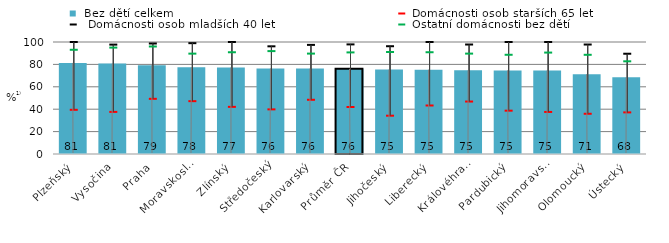
| Category |  Bez dětí celkem |
|---|---|
|   Plzeňský | 81.337 |
|   Vysočina | 80.741 |
|   Praha | 79.226 |
|   Moravskoslezský | 77.56 |
|   Zlínský | 77.287 |
|   Středočeský | 76.393 |
|   Karlovarský | 76.268 |
| Průměr ČR | 76.056 |
|   Jihočeský | 75.379 |
|   Liberecký | 75.278 |
|   Královéhradecký | 74.705 |
|   Pardubický | 74.653 |
|   Jihomoravský | 74.519 |
|   Olomoucký | 71.242 |
|   Ústecký | 68.428 |